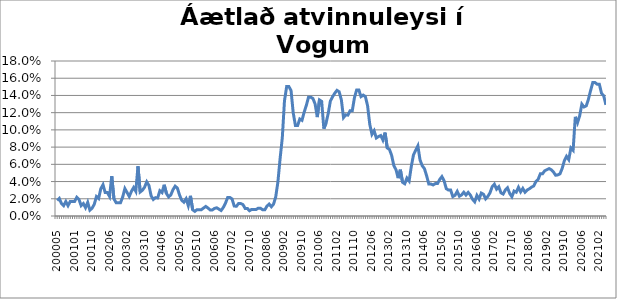
| Category | Series 0 |
|---|---|
| 200005 | 0.018 |
| 200006 | 0.02 |
| 200007 | 0.014 |
| 200008 | 0.012 |
| 200009 | 0.017 |
| 200010 | 0.012 |
| 200011 | 0.017 |
| 200012 | 0.017 |
| 200101 | 0.017 |
| 200102 | 0.022 |
| 200103 | 0.019 |
| 200104 | 0.012 |
| 200105 | 0.014 |
| 200106 | 0.01 |
| 200107 | 0.016 |
| 200109 | 0.007 |
| 200110 | 0.009 |
| 200111 | 0.014 |
| 200112 | 0.023 |
| 200201 | 0.02 |
| 200202 | 0.032 |
| 200203 | 0.036 |
| 200204 | 0.027 |
| 200205 | 0.027 |
| 200206 | 0.023 |
| 200207 | 0.046 |
| 200208 | 0.02 |
| 200209 | 0.015 |
| 200210 | 0.015 |
| 200211 | 0.015 |
| 200212 | 0.022 |
| 200301 | 0.032 |
| 200302 | 0.027 |
| 200303 | 0.023 |
| 200304 | 0.029 |
| 200305 | 0.033 |
| 200306 | 0.029 |
| 200307 | 0.058 |
| 200308 | 0.028 |
| 200309 | 0.03 |
| 200310 | 0.033 |
| 200311 | 0.04 |
| 200312 | 0.035 |
| 200401 | 0.023 |
| 200402 | 0.019 |
| 200403 | 0.021 |
| 200404 | 0.021 |
| 200405 | 0.029 |
| 200406 | 0.027 |
| 200407 | 0.036 |
| 200408 | 0.026 |
| 200409 | 0.022 |
| 200410 | 0.024 |
| 200411 | 0.031 |
| 200412 | 0.035 |
| 200501 | 0.032 |
| 200502 | 0.024 |
| 200503 | 0.018 |
| 200504 | 0.016 |
| 200505 | 0.02 |
| 200506 | 0.012 |
| 200507 | 0.023 |
| 200508 | 0.007 |
| 200509 | 0.005 |
| 200510 | 0.007 |
| 200511 | 0.007 |
| 200512 | 0.007 |
| 200601 | 0.009 |
| 200602 | 0.011 |
| 200603 | 0.009 |
| 200604 | 0.007 |
| 200605 | 0.007 |
| 200606 | 0.009 |
| 200607 | 0.01 |
| 200608 | 0.008 |
| 200609 | 0.006 |
| 200610 | 0.01 |
| 200611 | 0.015 |
| 200612 | 0.021 |
| 200701 | 0.022 |
| 200702 | 0.02 |
| 200703 | 0.012 |
| 200704 | 0.011 |
| 200705 | 0.014 |
| 200706 | 0.014 |
| 200707 | 0.013 |
| 200708 | 0.009 |
| 200709 | 0.009 |
| 200710 | 0.006 |
| 200711 | 0.008 |
| 200712 | 0.008 |
| 200801 | 0.008 |
| 200802 | 0.009 |
| 200803 | 0.009 |
| 200804 | 0.007 |
| 200805 | 0.007 |
| 200806 | 0.012 |
| 200807 | 0.014 |
| 200808 | 0.011 |
| 200809 | 0.014 |
| 200810 | 0.022 |
| 200811 | 0.04 |
| 200812 | 0.067 |
| 200901 | 0.091 |
| 200902 | 0.134 |
| 200903 | 0.15 |
| 200904 | 0.15 |
| 200905 | 0.146 |
| 200906 | 0.12 |
| 200907 | 0.105 |
| 200908 | 0.105 |
| 200909 | 0.113 |
| 200910 | 0.111 |
| 200911 | 0.121 |
| 200912 | 0.129 |
| 201001 | 0.138 |
| 201002 | 0.138 |
| 201003 | 0.136 |
| 201004 | 0.13 |
| 201005 | 0.115 |
| 201006 | 0.135 |
| 201007 | 0.133 |
| 201008 | 0.101 |
| 201009 | 0.108 |
| 201010 | 0.119 |
| 201011 | 0.134 |
| 201012 | 0.138 |
| 201101 | 0.143 |
| 201102 | 0.146 |
| 201103 | 0.144 |
| 201104 | 0.135 |
| 201105 | 0.114 |
| 201106 | 0.117 |
| 201107 | 0.117 |
| 201108 | 0.122 |
| 201109 | 0.122 |
| 201110 | 0.138 |
| 201111 | 0.146 |
| 201112 | 0.146 |
| 201201 | 0.139 |
| 201202 | 0.14 |
| 201203 | 0.139 |
| 201204 | 0.128 |
| 201205 | 0.106 |
| 201206 | 0.095 |
| 201207 | 0.099 |
| 201208 | 0.091 |
| 201209 | 0.092 |
| 201210 | 0.093 |
| 201211 | 0.088 |
| 201212 | 0.097 |
| 201301 | 0.079 |
| 201302 | 0.077 |
| 201303 | 0.07 |
| 201304 | 0.059 |
| 201305 | 0.054 |
| 201306 | 0.044 |
| 201307 | 0.054 |
| 201308 | 0.039 |
| 201309 | 0.037 |
| 201310 | 0.044 |
| 201311 | 0.041 |
| 201312 | 0.058 |
| 201401 | 0.071 |
| 201402 | 0.076 |
| 201403 | 0.081 |
| 201404 | 0.065 |
| 201405 | 0.058 |
| 201406 | 0.055 |
| 201407 | 0.047 |
| 201408 | 0.037 |
| 201409 | 0.037 |
| 201410 | 0.036 |
| 201411 | 0.038 |
| 201412 | 0.038 |
| 201501 | 0.042 |
| 201502 | 0.046 |
| 201503 | 0.041 |
| 201504 | 0.032 |
| 201505 | 0.03 |
| 201506 | 0.03 |
| 201507 | 0.023 |
| 201508 | 0.024 |
| 201509 | 0.029 |
| 201510 | 0.023 |
| 201511 | 0.025 |
| 201512 | 0.028 |
| 201601 | 0.024 |
| 201602 | 0.027 |
| 201603 | 0.024 |
| 201604 | 0.019 |
| 201605 | 0.016 |
| 201606 | 0.024 |
| 201607 | 0.02 |
| 201608 | 0.027 |
| 201609 | 0.025 |
| 201610 | 0.02 |
| 201611 | 0.023 |
| 201612 | 0.027 |
| 201701 | 0.034 |
| 201702 | 0.037 |
| 201703 | 0.031 |
| 201704 | 0.034 |
| 201705 | 0.027 |
| 201706 | 0.025 |
| 201707 | 0.03 |
| 201708 | 0.033 |
| 201709 | 0.026 |
| 201710 | 0.022 |
| 201711 | 0.029 |
| 201712 | 0.028 |
| 201801 | 0.033 |
| 201802 | 0.028 |
| 201803 | 0.032 |
| 201804 | 0.028 |
| 201805 | 0.03 |
| 201806 | 0.032 |
| 201807 | 0.034 |
| 201808 | 0.035 |
| 201809 | 0.04 |
| 201810 | 0.043 |
| 201811 | 0.049 |
| 201812 | 0.049 |
| 201901 | 0.052 |
| 201902 | 0.054 |
| 201903 | 0.055 |
| 201904 | 0.054 |
| 201905 | 0.051 |
| 201906 | 0.047 |
| 201907 | 0.048 |
| 201908 | 0.049 |
| 201909 | 0.055 |
| 201910 | 0.064 |
| 201911 | 0.069 |
| 201912 | 0.065 |
| 202001 | 0.079 |
| 202002 | 0.076 |
| 202003 | 0.115 |
| 202004 | 0.108 |
| 202005 | 0.116 |
| 202006 | 0.13 |
| 202007 | 0.127 |
| 202008 | 0.128 |
| 202009 | 0.136 |
| 202010 | 0.146 |
| 202011 | 0.155 |
| 202012 | 0.155 |
| 202101 | 0.153 |
| 202102 | 0.153 |
| 202103 | 0.142 |
| 202104 | 0.14 |
| 202105 | 0.129 |